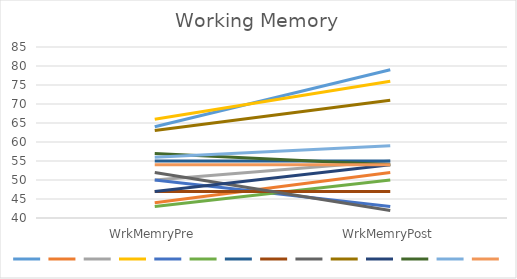
| Category | Series 0 | Series 1 | Series 2 | Series 3 | Series 4 | Series 5 | Series 6 | Series 7 | Series 8 | Series 9 | Series 10 | Series 11 | Series 12 | Series 13 |
|---|---|---|---|---|---|---|---|---|---|---|---|---|---|---|
| WrkMemryPre | 64 | 44 | 50 | 66 | 50 | 43 | 55 | 47 | 52 | 63 | 47 | 57 | 56 | 54 |
| WrkMemryPost | 79 | 52 | 55 | 76 | 43 | 50 | 55 | 47 | 42 | 71 | 54 | 54 | 59 | 54 |